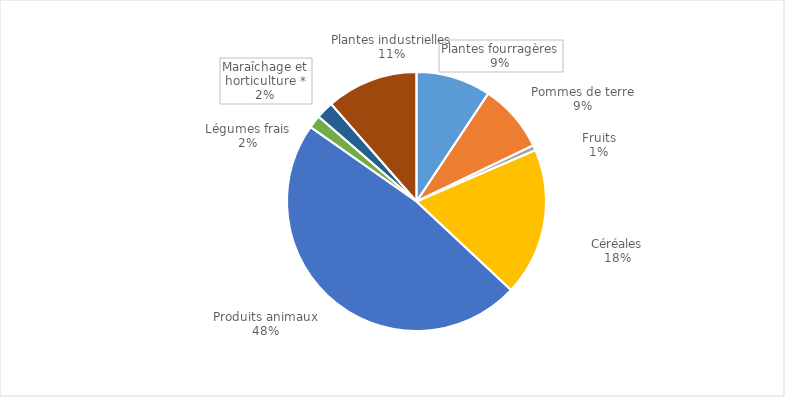
| Category | Series 0 |
|---|---|
| Plantes fourragères | 9.379 |
| Pommes de terre | 8.56 |
| Fruits | 0.663 |
| Céréales | 18.547 |
| Produits animaux | 48 |
| Légumes frais | 1.627 |
| Maraîchage et horticulture * | 2.2 |
| Plantes industrielles | 11.499 |